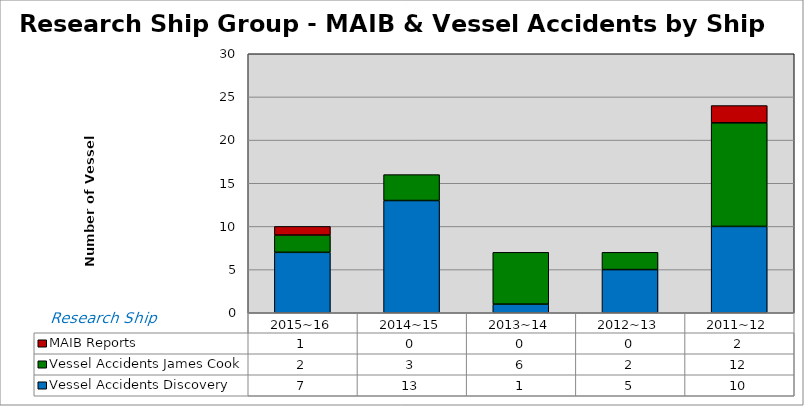
| Category | Vessel Accidents | MAIB Reports |
|---|---|---|
| 2015~16 | 2 | 1 |
| 2014~15 | 3 | 0 |
| 2013~14 | 6 | 0 |
| 2012~13 | 2 | 0 |
| 2011~12 | 12 | 2 |